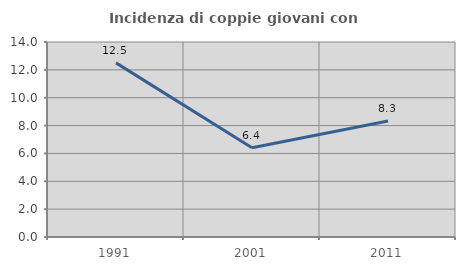
| Category | Incidenza di coppie giovani con figli |
|---|---|
| 1991.0 | 12.5 |
| 2001.0 | 6.41 |
| 2011.0 | 8.333 |